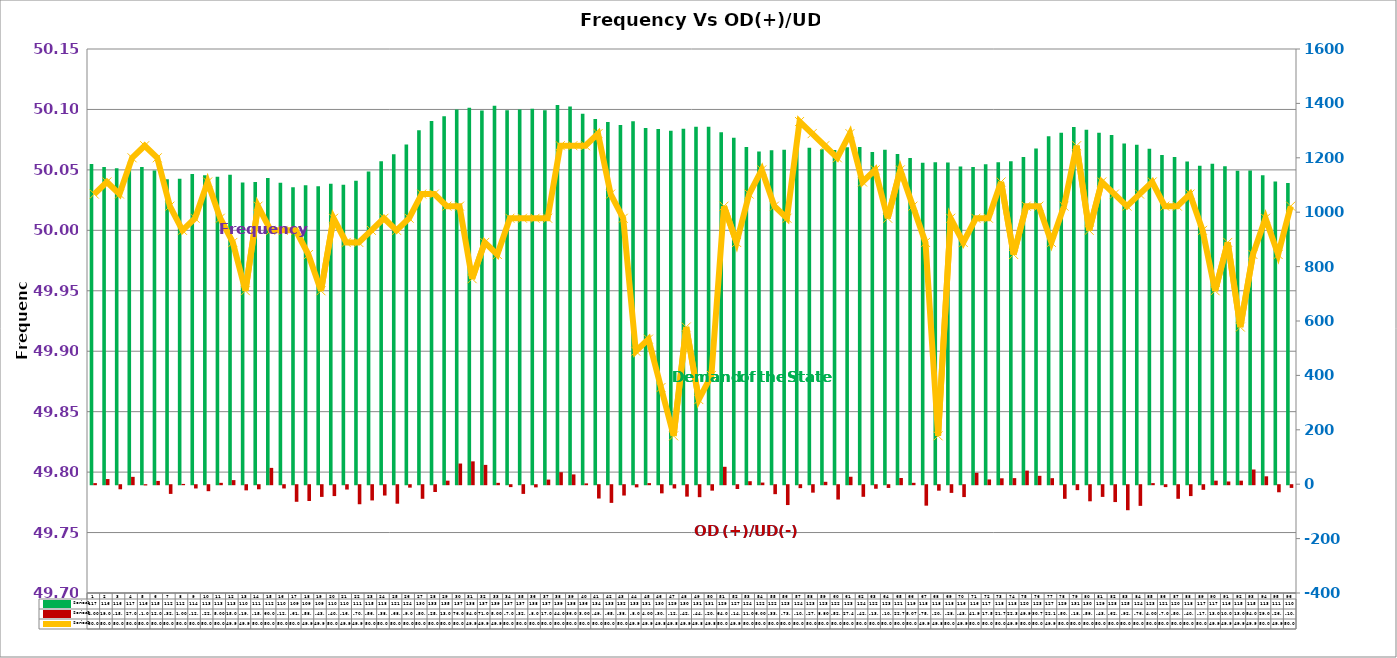
| Category | Series 2 | Series 4 |
|---|---|---|
| 0 | 1177 | 4 |
| 1 | 1166 | 19 |
| 2 | 1162 | -15 |
| 3 | 1170 | 27 |
| 4 | 1166 | -1 |
| 5 | 1153 | 12 |
| 6 | 1121 | -32 |
| 7 | 1123 | 1 |
| 8 | 1140 | -12 |
| 9 | 1136 | -22 |
| 10 | 1130 | 5 |
| 11 | 1138 | 15 |
| 12 | 1109 | -19 |
| 13 | 1111 | -15 |
| 14 | 1126 | 60 |
| 15 | 1108 | -12 |
| 16 | 1092 | -61 |
| 17 | 1099 | -58 |
| 18 | 1095 | -43 |
| 19 | 1105 | -40 |
| 20 | 1101 | -16 |
| 21 | 1116 | -70 |
| 22 | 1150 | -56 |
| 23 | 1187 | -38 |
| 24 | 1213 | -68 |
| 25 | 1249 | -9 |
| 26 | 1301 | -50 |
| 27 | 1335 | -25 |
| 28 | 1353 | 13 |
| 29 | 1378 | 76 |
| 30 | 1384 | 84 |
| 31 | 1374 | 71 |
| 32 | 1391 | 5 |
| 33 | 1375 | -7 |
| 34 | 1378 | -32 |
| 35 | 1380 | -8 |
| 36 | 1375 | 17 |
| 37 | 1394 | 44 |
| 38 | 1389 | 36 |
| 39 | 1362 | 3 |
| 40 | 1343 | -49 |
| 41 | 1332 | -65 |
| 42 | 1321 | -38 |
| 43 | 1334 | -8 |
| 44 | 1310 | 4 |
| 45 | 1306 | -30 |
| 46 | 1299 | -12 |
| 47 | 1307 | -42 |
| 48 | 1314 | -44 |
| 49 | 1314 | -20 |
| 50 | 1294 | 64 |
| 51 | 1274 | -14 |
| 52 | 1240 | 11 |
| 53 | 1223 | 6 |
| 54 | 1228 | -33 |
| 55 | 1230 | -73 |
| 56 | 1241 | -10.847 |
| 57 | 1237 | -27.407 |
| 58 | 1231 | 8.8 |
| 59 | 1229 | -52.69 |
| 60 | 1239 | 27.402 |
| 61 | 1240 | -42.695 |
| 62 | 1221 | -13.056 |
| 63 | 1230 | -10.071 |
| 64 | 1214 | 22.786 |
| 65 | 1199 | 5.068 |
| 66 | 1182 | -75.218 |
| 67 | 1184 | -20.168 |
| 68 | 1183 | -28.258 |
| 69 | 1168 | -43.621 |
| 70 | 1166 | 41.941 |
| 71 | 1176 | 17.499 |
| 72 | 1184 | 21.742 |
| 73 | 1187 | 22.371 |
| 74 | 1203 | 49.96 |
| 75 | 1234 | 30.76 |
| 76 | 1279 | 22.185 |
| 77 | 1292 | -50.057 |
| 78 | 1313 | -18.197 |
| 79 | 1303 | -59.197 |
| 80 | 1292 | -43 |
| 81 | 1284 | -62 |
| 82 | 1253 | -92 |
| 83 | 1248 | -76 |
| 84 | 1233 | 4 |
| 85 | 1210 | -7 |
| 86 | 1203 | -50 |
| 87 | 1186 | -40 |
| 88 | 1171 | -17 |
| 89 | 1178 | 13 |
| 90 | 1169 | 10 |
| 91 | 1152 | 13 |
| 92 | 1153 | 54 |
| 93 | 1136 | 29 |
| 94 | 1113 | -26 |
| 95 | 1107 | -10 |